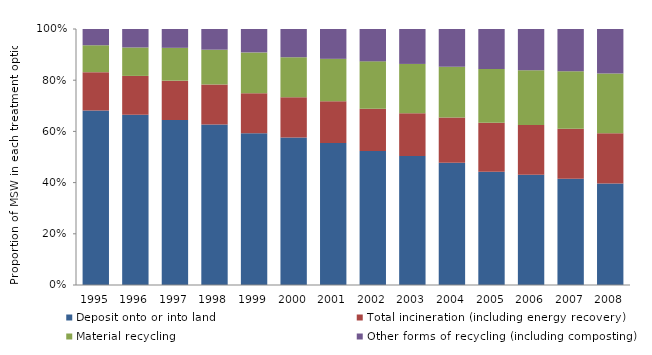
| Category | Deposit onto or into land | Total incineration (including energy recovery) | Material recycling | Other forms of recycling (including composting) |
|---|---|---|---|---|
| 1995 | 141262 | 31083 | 21808 | 13163 |
| 1996 | 138480 | 31582 | 23122 | 15024 |
| 1997 | 140275 | 33454 | 27939 | 16007 |
| 1998 | 136935 | 34192 | 29693 | 17647 |
| 1999 | 138267 | 36424 | 37212 | 21345 |
| 2000 | 139069 | 38068 | 37744 | 26629 |
| 2001 | 134564 | 39461 | 40123 | 28243 |
| 2002 | 130747 | 41056 | 46247 | 31551 |
| 2003 | 124085 | 41135 | 47477 | 33617 |
| 2004 | 117251 | 43370 | 48763 | 36174 |
| 2005 | 108528 | 46927 | 51496 | 38312 |
| 2006 | 108341 | 48887 | 53929 | 40447 |
| 2007 | 105747 | 49726 | 57390 | 42041 |
| 2008 | 100370 | 49560 | 59006 | 43927 |